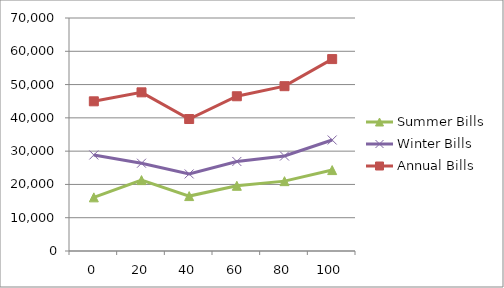
| Category | Summer Bills | Winter Bills | Annual Bills |
|---|---|---|---|
| 0.0 | 16117.896 | 28850.582 | 44968.478 |
| 20.0 | 21293.094 | 26375.677 | 47668.77 |
| 40.0 | 16496.363 | 23153.576 | 39649.939 |
| 60.0 | 19592.152 | 26897.18 | 46489.332 |
| 80.0 | 20987.662 | 28529.921 | 49517.582 |
| 100.0 | 24309.128 | 33347.866 | 57656.993 |